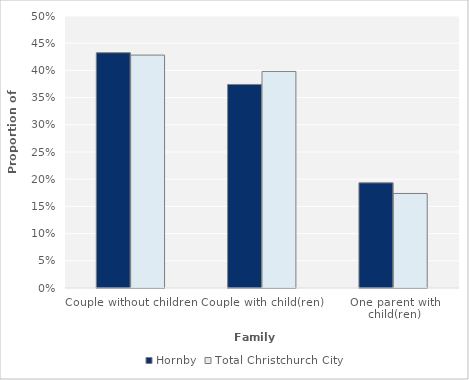
| Category | Hornby | Total Christchurch City |
|---|---|---|
| Couple without children | 0.433 | 0.428 |
| Couple with child(ren) | 0.374 | 0.398 |
| One parent with child(ren) | 0.193 | 0.174 |